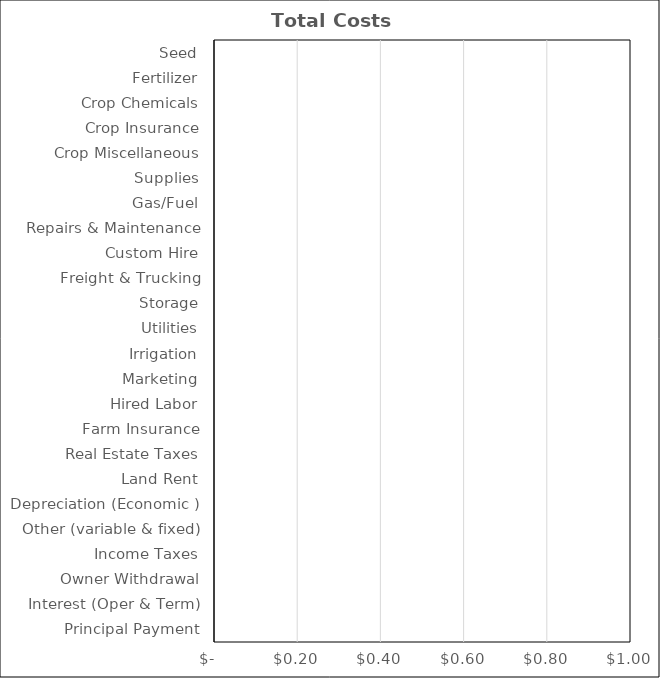
| Category | Soybeans |
|---|---|
| Seed | 0 |
| Fertilizer | 0 |
| Crop Chemicals | 0 |
| Crop Insurance | 0 |
| Crop Miscellaneous | 0 |
| Supplies | 0 |
| Gas/Fuel | 0 |
| Repairs & Maintenance | 0 |
| Custom Hire | 0 |
| Freight & Trucking | 0 |
| Storage | 0 |
| Utilities | 0 |
| Irrigation | 0 |
| Marketing | 0 |
| Hired Labor | 0 |
| Farm Insurance | 0 |
| Real Estate Taxes | 0 |
| Land Rent | 0 |
| Depreciation (Economic ) | 0 |
| Other (variable & fixed) | 0 |
| Income Taxes | 0 |
| Owner Withdrawal | 0 |
| Interest (Oper & Term) | 0 |
| Principal Payment | 0 |